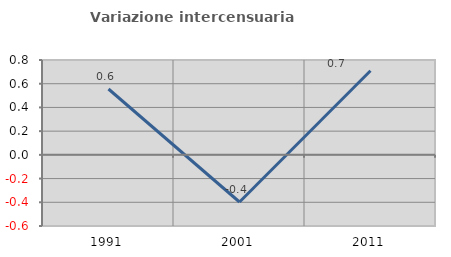
| Category | Variazione intercensuaria annua |
|---|---|
| 1991.0 | 0.555 |
| 2001.0 | -0.398 |
| 2011.0 | 0.709 |